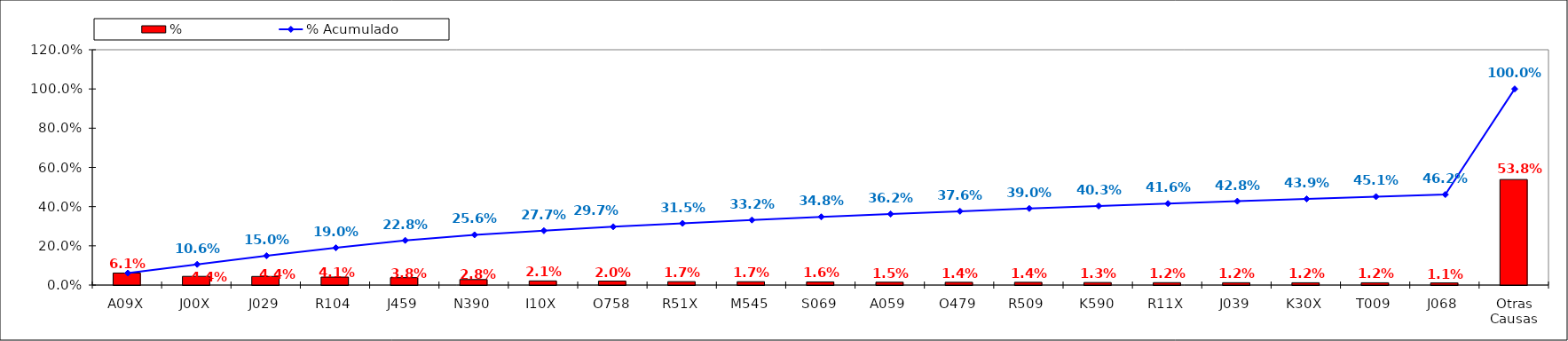
| Category | % |
|---|---|
| A09X | 0.061 |
| J00X | 0.044 |
| J029 | 0.044 |
| R104 | 0.041 |
| J459 | 0.038 |
| N390 | 0.028 |
| I10X | 0.021 |
| O758 | 0.02 |
| R51X | 0.017 |
| M545 | 0.017 |
| S069 | 0.016 |
| A059 | 0.015 |
| O479 | 0.014 |
| R509 | 0.014 |
| K590 | 0.013 |
| R11X | 0.012 |
| J039 | 0.012 |
| K30X | 0.012 |
| T009 | 0.012 |
| J068 | 0.011 |
| Otras Causas | 0.538 |